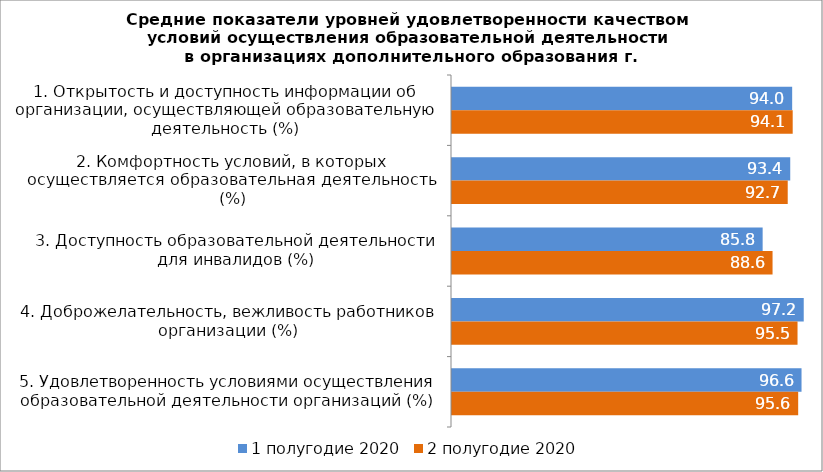
| Category | 1 полугодие 2020 | 2 полугодие 2020 |
|---|---|---|
| 1. Открытость и доступность информации об организации, осуществляющей образовательную деятельность (%) | 93.97 | 94.115 |
| 2. Комфортность условий, в которых осуществляется образовательная деятельность (%) | 93.435 | 92.74 |
| 3. Доступность образовательной деятельности для инвалидов (%) | 85.815 | 88.55 |
| 4. Доброжелательность, вежливость работников организации (%) | 97.165 | 95.45 |
| 5. Удовлетворенность условиями осуществления образовательной деятельности организаций (%) | 96.555 | 95.63 |